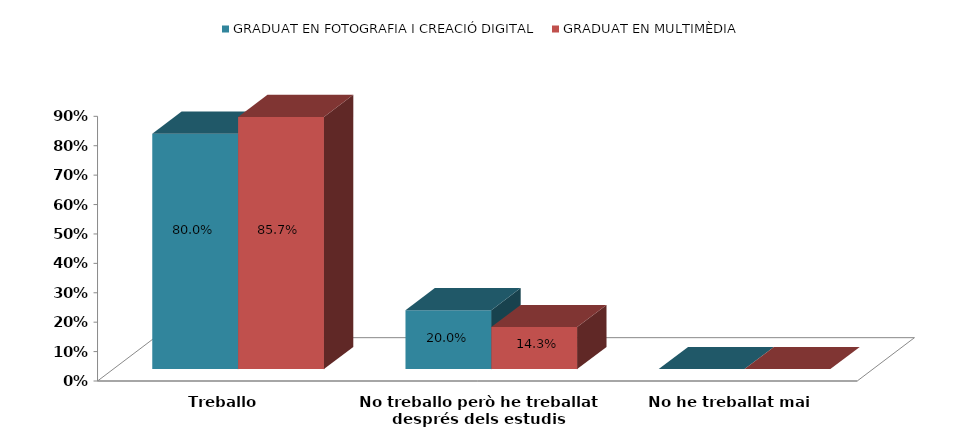
| Category | GRADUAT EN FOTOGRAFIA I CREACIÓ DIGITAL | GRADUAT EN MULTIMÈDIA |
|---|---|---|
| Treballo | 0.8 | 0.857 |
| No treballo però he treballat després dels estudis | 0.2 | 0.143 |
| No he treballat mai | 0 | 0 |